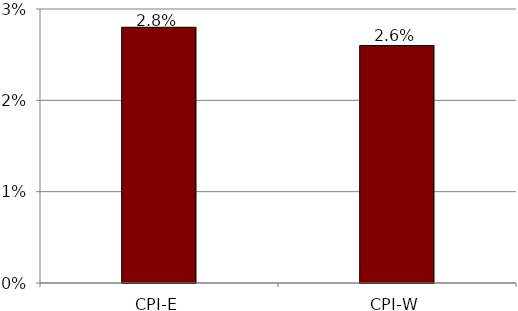
| Category | Series 0 |
|---|---|
| CPI-E | 0.028 |
| CPI-W | 0.026 |